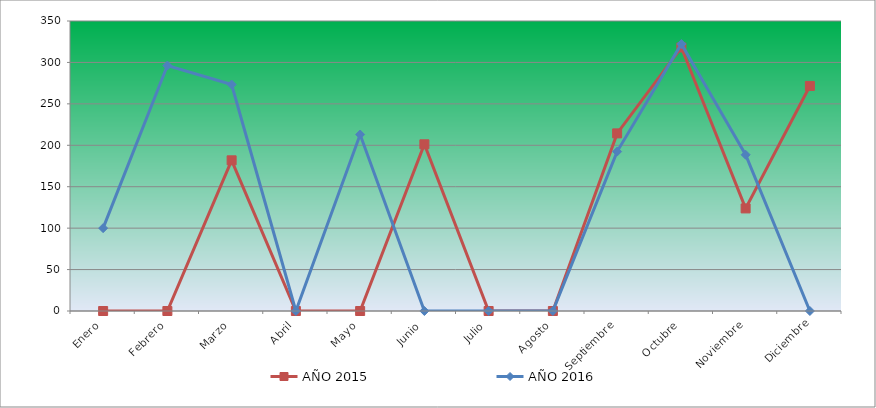
| Category | AÑO 2015 | AÑO 2016 |
|---|---|---|
| Enero | 0 | 100.012 |
| Febrero | 0 | 296.22 |
| Marzo | 181.856 | 273.316 |
| Abril | 0 | 0 |
| Mayo | 0 | 213.003 |
| Junio | 201.202 | 0 |
| Julio | 0 | 0 |
| Agosto | 0 | 0 |
| Septiembre | 214.358 | 192.39 |
| Octubre | 318.055 | 322.177 |
| Noviembre | 123.817 | 188.573 |
| Diciembre | 271.623 | 0 |